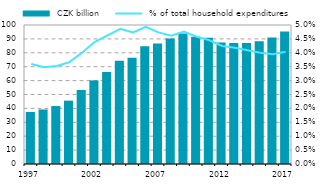
| Category |  CZK billion |
|---|---|
| 1997.0 | 37.442 |
| 1998.0 | 39.238 |
| 1999.0 | 41.694 |
| 2000.0 | 45.597 |
| 2001.0 | 53.227 |
| 2002.0 | 60.134 |
| 2003.0 | 66.257 |
| 2004.0 | 74.326 |
| 2005.0 | 76.397 |
| 2006.0 | 84.712 |
| 2007.0 | 86.742 |
| 2008.0 | 90.292 |
| 2009.0 | 93.922 |
| 2010.0 | 91.486 |
| 2011.0 | 90.847 |
| 2012.0 | 87.469 |
| 2013.0 | 87.07 |
| 2014.0 | 86.984 |
| 2015.0 | 88.331 |
| 2016.0 | 90.96 |
| 2017.0 | 95.342 |